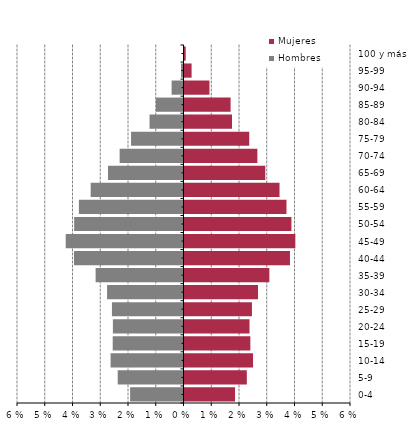
| Category | Hombres | Mujeres |
|---|---|---|
| 0-4 | -0.019 | 0.018 |
| 5-9 | -0.024 | 0.022 |
| 10-14 | -0.026 | 0.025 |
| 15-19 | -0.026 | 0.024 |
| 20-24 | -0.025 | 0.023 |
| 25-29 | -0.026 | 0.024 |
| 30-34 | -0.028 | 0.026 |
| 35-39 | -0.032 | 0.031 |
| 40-44 | -0.039 | 0.038 |
| 45-49 | -0.042 | 0.04 |
| 50-54 | -0.039 | 0.039 |
| 55-59 | -0.038 | 0.037 |
| 60-64 | -0.033 | 0.034 |
| 65-69 | -0.027 | 0.029 |
| 70-74 | -0.023 | 0.026 |
| 75-79 | -0.019 | 0.023 |
| 80-84 | -0.012 | 0.017 |
| 85-89 | -0.01 | 0.017 |
| 90-94 | -0.004 | 0.009 |
| 95-99 | -0.001 | 0.003 |
| 100 y más | 0 | 0 |